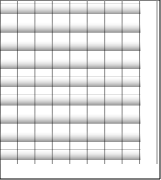
| Category | Series 0 |
|---|---|
| 0 | 8 |
| 1 | 8 |
| 2 | 8 |
| 3 | 8 |
| 4 | 8 |
| 5 | 8 |
| 6 | 8 |
| 7 | 8 |
| 8 | 8 |